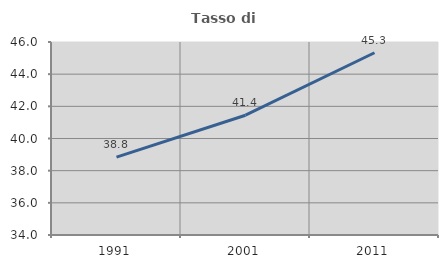
| Category | Tasso di occupazione   |
|---|---|
| 1991.0 | 38.842 |
| 2001.0 | 41.448 |
| 2011.0 | 45.33 |